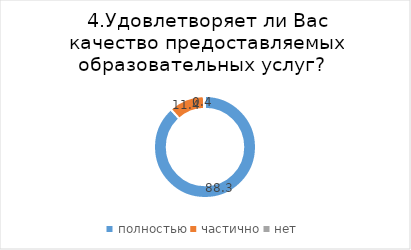
| Category | Series 0 |
|---|---|
| полностью | 88.278 |
| частично | 11.355 |
| нет | 0.366 |